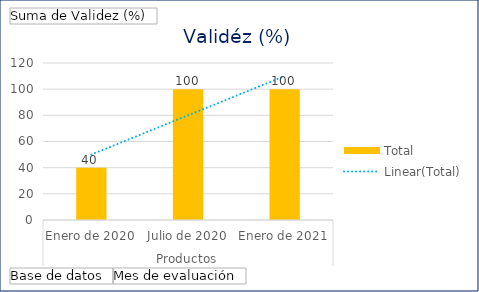
| Category | Total |
|---|---|
| 0 | 40 |
| 1 | 100 |
| 2 | 100 |